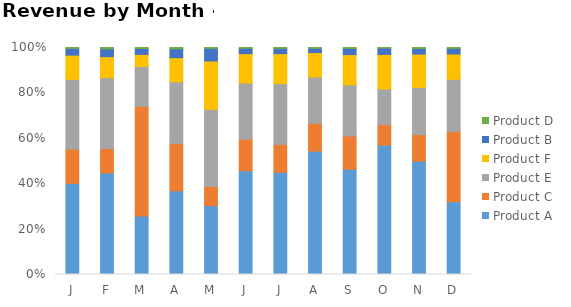
| Category | Product A | Product C | Product E | Product F | Product B | Product D |
|---|---|---|---|---|---|---|
| J | 0.401 | 0.15 | 0.308 | 0.107 | 0.029 | 0.004 |
| F | 0.447 | 0.108 | 0.312 | 0.093 | 0.034 | 0.006 |
| M | 0.257 | 0.483 | 0.175 | 0.054 | 0.026 | 0.004 |
| A | 0.369 | 0.208 | 0.271 | 0.107 | 0.039 | 0.005 |
| M | 0.303 | 0.084 | 0.34 | 0.213 | 0.055 | 0.004 |
| J | 0.457 | 0.139 | 0.247 | 0.13 | 0.024 | 0.003 |
| J | 0.45 | 0.123 | 0.267 | 0.132 | 0.023 | 0.004 |
| A | 0.543 | 0.123 | 0.204 | 0.108 | 0.019 | 0.003 |
| S | 0.464 | 0.146 | 0.225 | 0.133 | 0.028 | 0.004 |
| O | 0.57 | 0.09 | 0.157 | 0.152 | 0.028 | 0.002 |
| N | 0.499 | 0.117 | 0.208 | 0.147 | 0.025 | 0.004 |
| D | 0.321 | 0.309 | 0.23 | 0.111 | 0.025 | 0.004 |